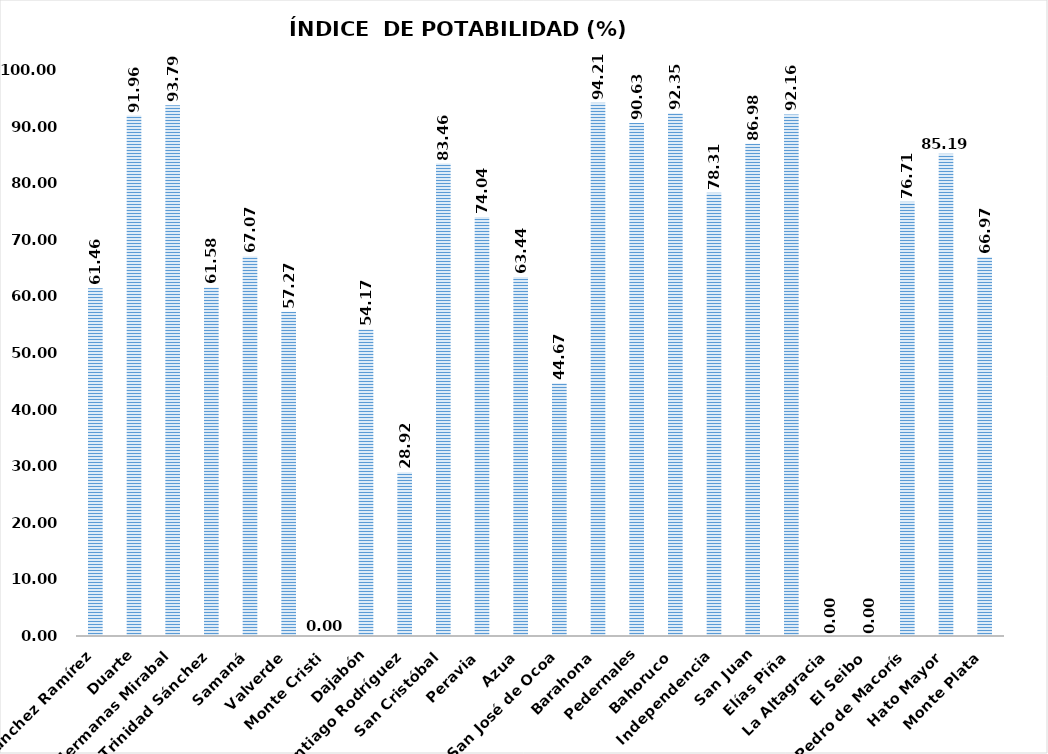
| Category | 61.46  |
|---|---|
| Sánchez Ramírez | 61.458 |
| Duarte | 91.96 |
| Hermanas Mirabal | 93.785 |
| María Trinidad Sánchez | 61.579 |
| Samaná | 67.066 |
| Valverde | 57.273 |
| Monte Cristi | 0 |
| Dajabón | 54.167 |
| Santiago Rodríguez | 28.916 |
| San Cristóbal | 83.463 |
| Peravia | 74.038 |
| Azua | 63.441 |
| San José de Ocoa | 44.667 |
| Barahona | 94.212 |
| Pedernales | 90.625 |
| Bahoruco | 92.353 |
| Independencia | 78.313 |
| San Juan | 86.982 |
| Elías Piña | 92.157 |
| La Altagracia | 0 |
| El Seibo | 0 |
| San Pedro de Macorís | 76.712 |
| Hato Mayor | 85.185 |
| Monte Plata | 66.968 |